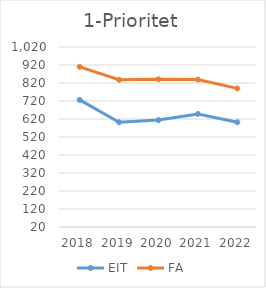
| Category | EIT | FA |
|---|---|---|
| 2018 | 726 | 910 |
| 2019 | 602 | 838 |
| 2020 | 614 | 841 |
| 2021 | 648 | 839 |
| 2022 | 602 | 790 |